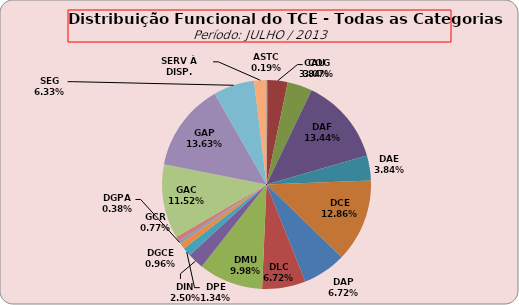
| Category | ASTC COG CAU DAF DAE DCE DAP DLC DMU DIN DPE DGCE DGPA GCR GAC GAP SEG SERV À DISP. |
|---|---|
| ASTC | 1 |
| COG | 16 |
| CAU | 20 |
| DAF | 70 |
| DAE | 20 |
| DCE | 67 |
| DAP | 35 |
| DLC | 35 |
| DMU | 52 |
| DIN | 13 |
| DPE | 7 |
| DGCE | 5 |
| DGPA | 2 |
| GCR | 4 |
| GAC | 60 |
| GAP | 71 |
| SEG | 33 |
| SERV À DISP. | 10 |